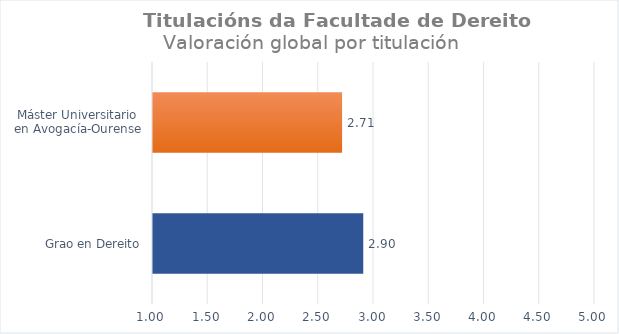
| Category | Series 0 |
|---|---|
| Grao en Dereito | 2.903 |
| Máster Universitario en Avogacía-Ourense | 2.711 |